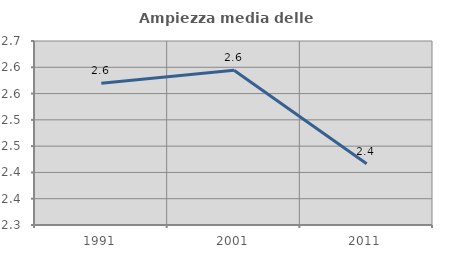
| Category | Ampiezza media delle famiglie |
|---|---|
| 1991.0 | 2.57 |
| 2001.0 | 2.594 |
| 2011.0 | 2.417 |